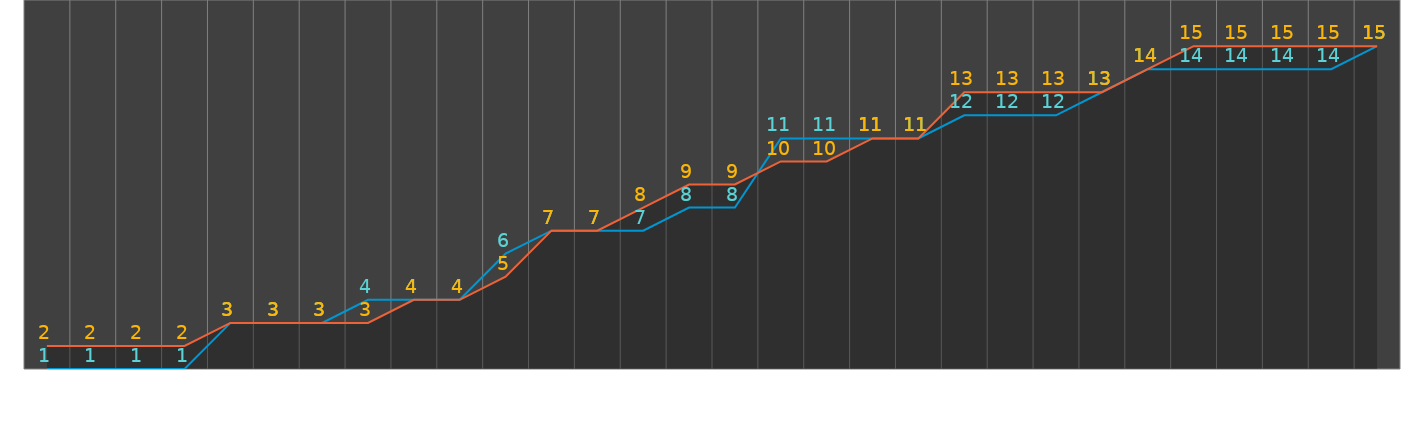
| Category | Opened | Closed | Opened Lables | Closed Labels |
|---|---|---|---|---|
| 5/1/22 | 0 | 1 | 0.56 | 1.56 |
| 5/2/22 | 0 | 1 | 0.56 | 1.56 |
| 5/3/22 | 0 | 1 | 0.56 | 1.56 |
| 5/4/22 | 0 | 1 | 0.56 | 1.56 |
| 5/5/22 | 2 | 2 | 2.56 | 2.56 |
| 5/6/22 | 2 | 2 | 2.56 | 2.56 |
| 5/7/22 | 2 | 2 | 2.56 | 2.56 |
| 5/8/22 | 3 | 2 | 3.56 | 2.56 |
| 5/9/22 | 3 | 3 | 3.56 | 3.56 |
| 5/10/22 | 3 | 3 | 3.56 | 3.56 |
| 5/11/22 | 5 | 4 | 5.56 | 4.56 |
| 5/12/22 | 6 | 6 | 6.56 | 6.56 |
| 5/13/22 | 6 | 6 | 6.56 | 6.56 |
| 5/14/22 | 6 | 7 | 6.56 | 7.56 |
| 5/15/22 | 7 | 8 | 7.56 | 8.56 |
| 5/16/22 | 7 | 8 | 7.56 | 8.56 |
| 5/17/22 | 10 | 9 | 10.56 | 9.56 |
| 5/18/22 | 10 | 9 | 10.56 | 9.56 |
| 5/19/22 | 10 | 10 | 10.56 | 10.56 |
| 5/20/22 | 10 | 10 | 10.56 | 10.56 |
| 5/21/22 | 11 | 12 | 11.56 | 12.56 |
| 5/22/22 | 11 | 12 | 11.56 | 12.56 |
| 5/23/22 | 11 | 12 | 11.56 | 12.56 |
| 5/24/22 | 12 | 12 | 12.56 | 12.56 |
| 5/25/22 | 13 | 13 | 13.56 | 13.56 |
| 5/26/22 | 13 | 14 | 13.56 | 14.56 |
| 5/27/22 | 13 | 14 | 13.56 | 14.56 |
| 5/28/22 | 13 | 14 | 13.56 | 14.56 |
| 5/29/22 | 13 | 14 | 13.56 | 14.56 |
| 5/30/22 | 14 | 14 | 14.56 | 14.56 |